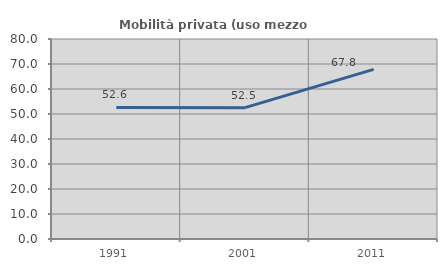
| Category | Mobilità privata (uso mezzo privato) |
|---|---|
| 1991.0 | 52.607 |
| 2001.0 | 52.535 |
| 2011.0 | 67.826 |